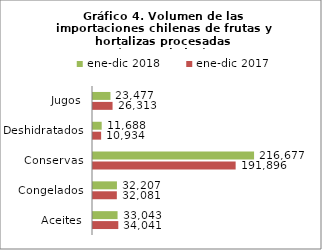
| Category | ene-dic 2017 | ene-dic 2018 |
|---|---|---|
| Aceites | 34041007.052 | 33043286.736 |
| Congelados | 32080893.422 | 32206984.472 |
| Conservas | 191895975.33 | 216676562.779 |
| Deshidratados | 10933573.41 | 11687612.248 |
| Jugos | 26312847.224 | 23477211.525 |